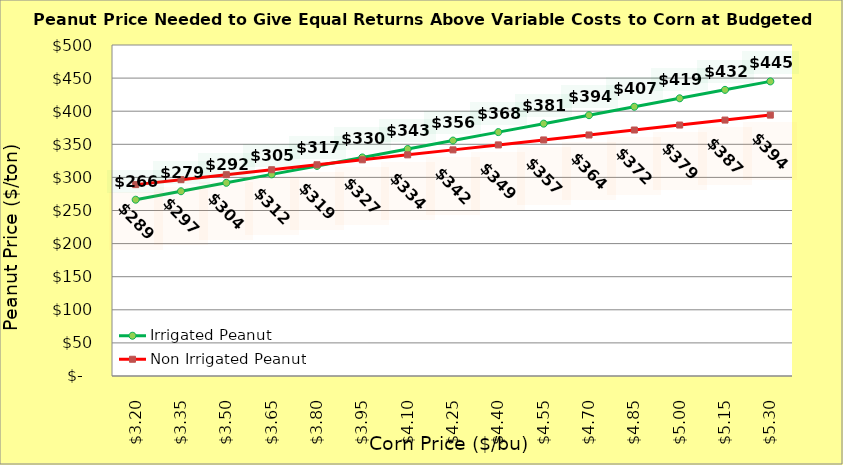
| Category | Irrigated Peanut | Non Irrigated Peanut |
|---|---|---|
| 3.2 | 266.296 | 289.09 |
| 3.35 | 279.062 | 296.59 |
| 3.5 | 291.828 | 304.09 |
| 3.65 | 304.594 | 311.59 |
| 3.8 | 317.36 | 319.09 |
| 3.9499999999999997 | 330.126 | 326.59 |
| 4.1 | 342.892 | 334.09 |
| 4.25 | 355.658 | 341.59 |
| 4.4 | 368.424 | 349.09 |
| 4.550000000000001 | 381.19 | 356.59 |
| 4.700000000000001 | 393.956 | 364.09 |
| 4.850000000000001 | 406.721 | 371.59 |
| 5.000000000000002 | 419.487 | 379.09 |
| 5.150000000000002 | 432.253 | 386.59 |
| 5.3000000000000025 | 445.019 | 394.09 |